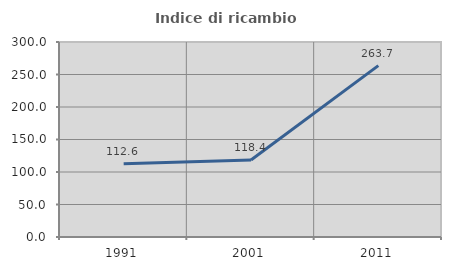
| Category | Indice di ricambio occupazionale  |
|---|---|
| 1991.0 | 112.571 |
| 2001.0 | 118.362 |
| 2011.0 | 263.673 |